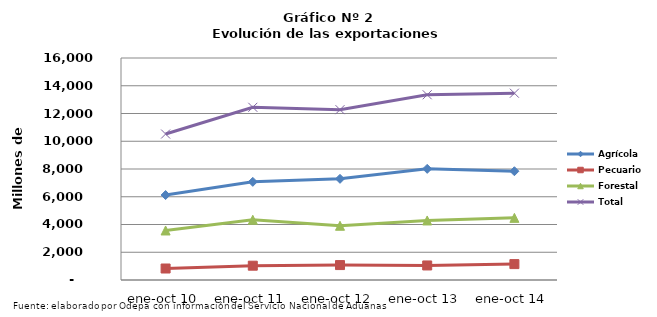
| Category | Agrícola | Pecuario | Forestal | Total |
|---|---|---|---|---|
| ene-oct 10 | 6123406 | 828437 | 3569425 | 10521268 |
| ene-oct 11 | 7074058 | 1031446 | 4342129 | 12447633 |
| ene-oct 12 | 7291332 | 1075827 | 3909857 | 12277016 |
| ene-oct 13 | 8011075 | 1047609 | 4290867 | 13349551 |
| ene-oct 14 | 7839621 | 1146043 | 4478134 | 13463798 |